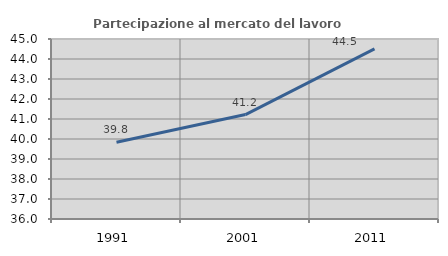
| Category | Partecipazione al mercato del lavoro  femminile |
|---|---|
| 1991.0 | 39.84 |
| 2001.0 | 41.223 |
| 2011.0 | 44.505 |